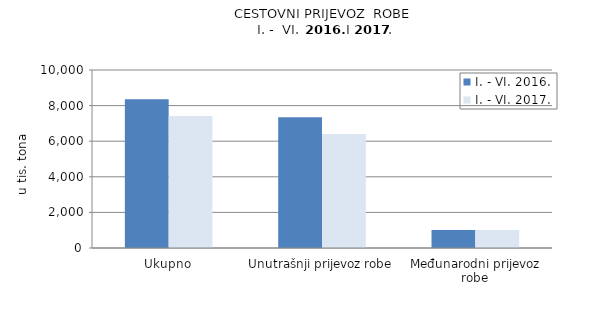
| Category | I. - VI. 2016. | I. - VI. 2017. |
|---|---|---|
| Ukupno | 8359 | 7409 |
| Unutrašnji prijevoz robe | 7348 | 6398 |
| Međunarodni prijevoz robe | 1011 | 1011 |